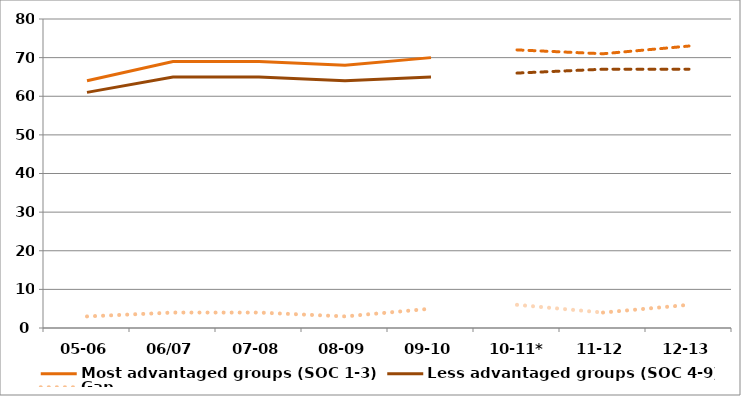
| Category | Most advantaged groups (SOC 1-3) | Less advantaged groups (SOC 4-9) | Gap |
|---|---|---|---|
| 05-06 | 64 | 61 | 3 |
| 06/07 | 69 | 65 | 4 |
| 07-08 | 69 | 65 | 4 |
| 08-09 | 68 | 64 | 3 |
| 09-10 | 70 | 65 | 5 |
| 10-11* | 72 | 66 | 6 |
| 11-12 | 71 | 67 | 4 |
| 12-13 | 73 | 67 | 6 |